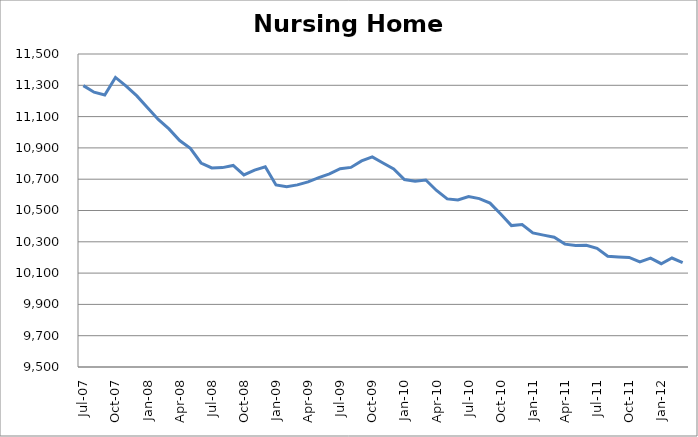
| Category | Series 0 |
|---|---|
| 2007-07-01 | 11298 |
| 2007-08-01 | 11256 |
| 2007-09-01 | 11238 |
| 2007-10-01 | 11350.263 |
| 2007-11-01 | 11294.74 |
| 2007-12-01 | 11232.318 |
| 2008-01-01 | 11156.288 |
| 2008-02-01 | 11081.627 |
| 2008-03-01 | 11021.19 |
| 2008-04-01 | 10947.191 |
| 2008-05-01 | 10896.867 |
| 2008-06-01 | 10803.447 |
| 2008-07-01 | 10772.354 |
| 2008-08-01 | 10774.008 |
| 2008-09-01 | 10787.758 |
| 2008-10-01 | 10727.699 |
| 2008-11-01 | 10758.178 |
| 2008-12-01 | 10779.631 |
| 2009-01-01 | 10663.435 |
| 2009-02-01 | 10651.149 |
| 2009-03-01 | 10663.766 |
| 2009-04-01 | 10683.045 |
| 2009-05-01 | 10710.452 |
| 2009-06-01 | 10734.079 |
| 2009-07-01 | 10766.92 |
| 2009-08-01 | 10775.284 |
| 2009-09-01 | 10816.772 |
| 2009-10-01 | 10842.761 |
| 2009-11-01 | 10803.777 |
| 2009-12-01 | 10766.211 |
| 2010-01-01 | 10697.93 |
| 2010-02-01 | 10687.061 |
| 2010-03-01 | 10694.953 |
| 2010-04-01 | 10627.995 |
| 2010-05-01 | 10574.126 |
| 2010-06-01 | 10566.802 |
| 2010-07-01 | 10589.72 |
| 2010-08-01 | 10575.685 |
| 2010-09-01 | 10547.191 |
| 2010-10-01 | 10477.965 |
| 2010-11-01 | 10403.494 |
| 2010-12-01 | 10410.629 |
| 2011-01-01 | 10356.43 |
| 2011-02-01 | 10342.584 |
| 2011-03-01 | 10329.59 |
| 2011-04-01 | 10285.171 |
| 2011-05-01 | 10275.721 |
| 2011-06-01 | 10277.138 |
| 2011-07-01 | 10258.237 |
| 2011-08-01 | 10207.865 |
| 2011-09-01 | 10203.423 |
| 2011-10-01 | 10199.926 |
| 2011-11-01 | 10171.763 |
| 2011-12-01 | 10195.626 |
| 2012-01-01 | 10160.044 |
| 2012-02-01 | 10196.335 |
| 2012-03-01 | 10166.802 |